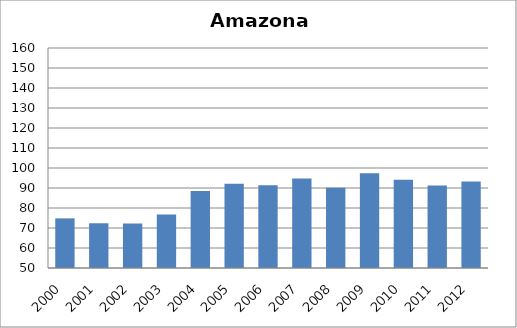
| Category | Tetravalente/DTP |
|---|---|
| 2000.0 | 74.81 |
| 2001.0 | 72.37 |
| 2002.0 | 72.21 |
| 2003.0 | 76.79 |
| 2004.0 | 88.5 |
| 2005.0 | 92.16 |
| 2006.0 | 91.34 |
| 2007.0 | 94.78 |
| 2008.0 | 90.15 |
| 2009.0 | 97.41 |
| 2010.0 | 94.17 |
| 2011.0 | 91.25 |
| 2012.0 | 93.26 |